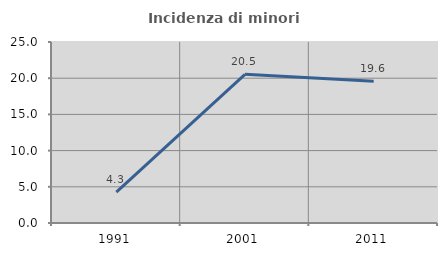
| Category | Incidenza di minori stranieri |
|---|---|
| 1991.0 | 4.255 |
| 2001.0 | 20.536 |
| 2011.0 | 19.574 |